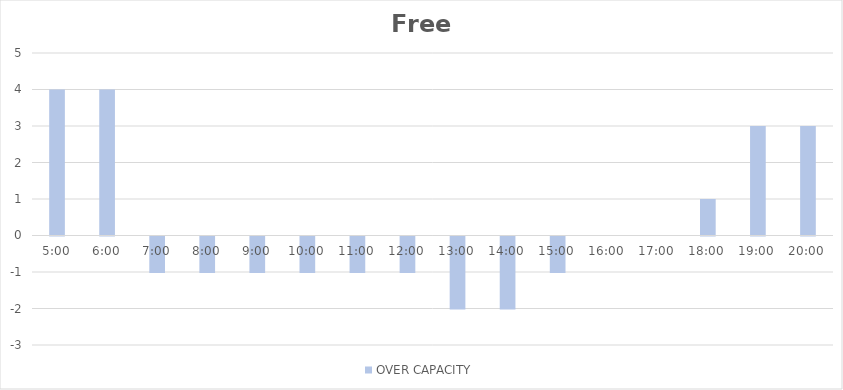
| Category | OVER CAPACITY |
|---|---|
| 0.20833333333333334 | 4 |
| 0.25 | 4 |
| 0.2916666666666667 | -1 |
| 0.3333333333333333 | -1 |
| 0.375 | -1 |
| 0.4166666666666667 | -1 |
| 0.4583333333333333 | -1 |
| 0.5 | -1 |
| 0.5416666666666666 | -2 |
| 0.5833333333333334 | -2 |
| 0.625 | -1 |
| 0.6666666666666666 | 0 |
| 0.7083333333333334 | 0 |
| 0.75 | 1 |
| 0.7916666666666666 | 3 |
| 0.8333333333333334 | 3 |